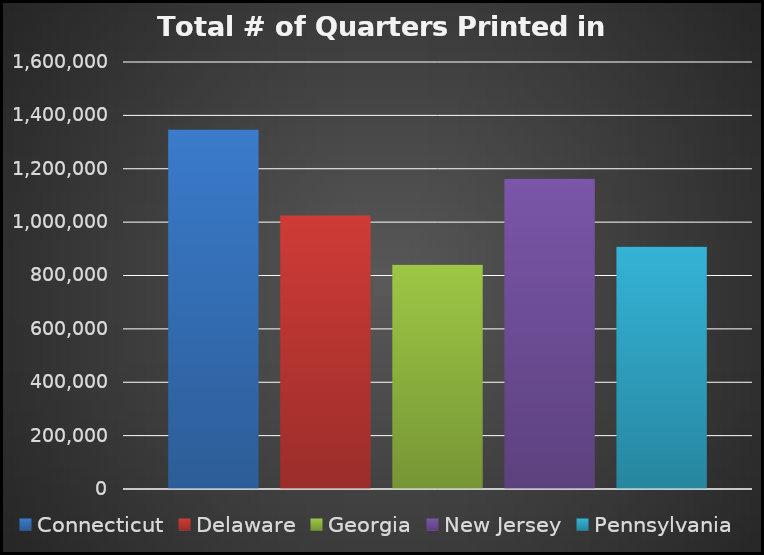
| Category | Connecticut | Delaware | Georgia | New Jersey | Pennsylvania |
|---|---|---|---|---|---|
|  | 1346624 | 1024824 | 839932 | 1162228 | 907332 |